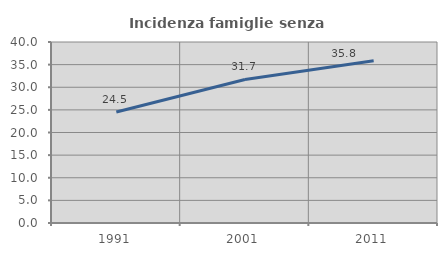
| Category | Incidenza famiglie senza nuclei |
|---|---|
| 1991.0 | 24.514 |
| 2001.0 | 31.728 |
| 2011.0 | 35.847 |